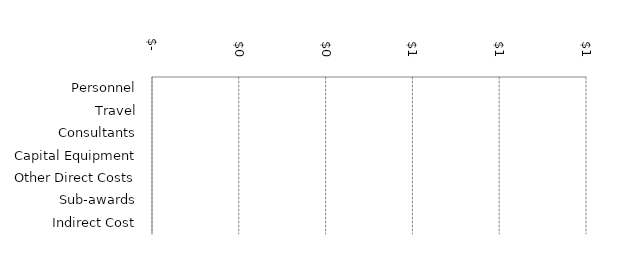
| Category | Series 1 |
|---|---|
| Personnel | 0 |
| Travel | 0 |
| Consultants | 0 |
| Capital Equipment | 0 |
| Other Direct Costs | 0 |
| Sub-awards | 0 |
| Indirect Cost | 0 |